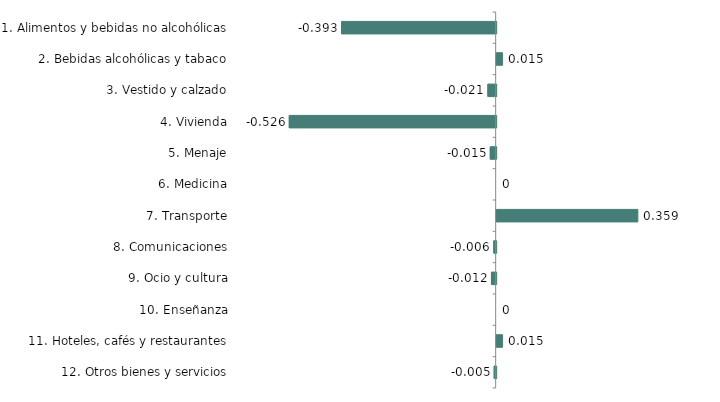
| Category | Series 0 |
|---|---|
| 1. Alimentos y bebidas no alcohólicas | -0.393 |
| 2. Bebidas alcohólicas y tabaco | 0.015 |
| 3. Vestido y calzado | -0.021 |
| 4. Vivienda | -0.526 |
| 5. Menaje | -0.015 |
| 6. Medicina | 0 |
| 7. Transporte | 0.359 |
| 8. Comunicaciones | -0.006 |
| 9. Ocio y cultura | -0.012 |
| 10. Enseñanza | 0 |
| 11. Hoteles, cafés y restaurantes | 0.015 |
| 12. Otros bienes y servicios | -0.005 |